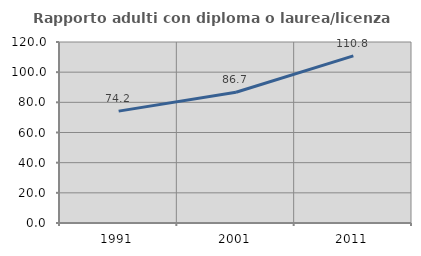
| Category | Rapporto adulti con diploma o laurea/licenza media  |
|---|---|
| 1991.0 | 74.173 |
| 2001.0 | 86.688 |
| 2011.0 | 110.818 |